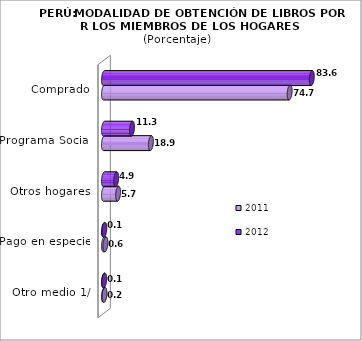
| Category | 2011 | 2012 |
|---|---|---|
| Otro medio 1/ | 0.194 | 0.08 |
| Pago en especie | 0.563 | 0.126 |
| Otros hogares | 5.663 | 4.894 |
| Programa Social | 18.868 | 11.28 |
| Comprado | 74.712 | 83.62 |